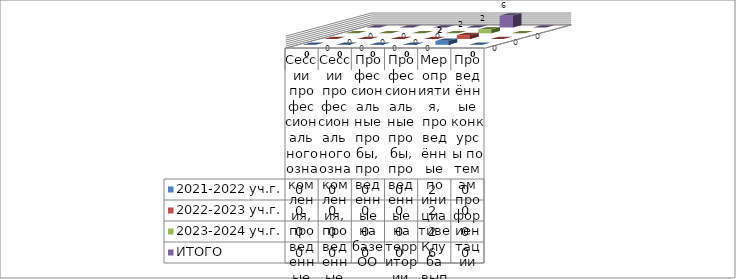
| Category | 2021-2022 уч.г. | 2022-2023 уч.г. | 2023-2024 уч.г. | ИТОГО |
|---|---|---|---|---|
| Сессии профессионального ознакомления, проведенные на базе ОО | 0 | 0 | 0 | 0 |
| Сессии профессионального ознакомления, проведенные на территории организаций-партнёров | 0 | 0 | 0 | 0 |
| Профессиональные пробы, проведенные на базе ОО | 0 | 0 | 0 | 0 |
| Профессиональные пробы, проведенные на территории организации-партнёра | 0 | 0 | 0 | 0 |
| Мероприятия, проведённые по инициативе Клуба выпускников школы | 2 | 2 | 2 | 6 |
| Проведённые конкурсы по темам профориентации | 0 | 0 | 0 | 0 |